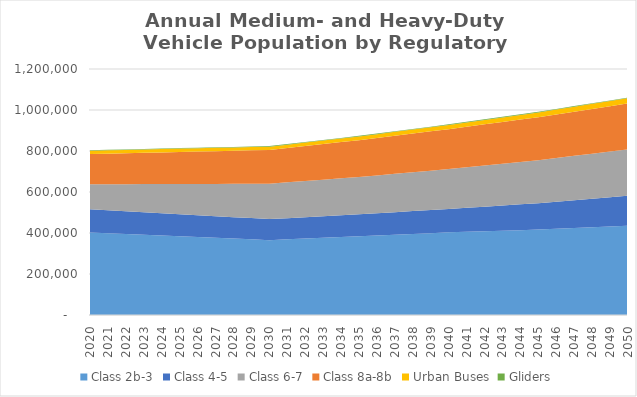
| Category | Class 2b-3 | Class 4-5 | Class 6-7 | Class 8a-8b | Urban Buses | Gliders |
|---|---|---|---|---|---|---|
| 2020.0 | 402990 | 112940 | 121620 | 147440 | 16210 | 2140 |
| 2021.0 | 399220 | 111900 | 126720 | 149190 | 16250 | 2220 |
| 2022.0 | 395440 | 110860 | 131830 | 150950 | 16300 | 2290 |
| 2023.0 | 391670 | 109820 | 136930 | 152700 | 16340 | 2370 |
| 2024.0 | 387890 | 108780 | 142040 | 154460 | 16390 | 2440 |
| 2025.0 | 384120 | 107740 | 147140 | 156210 | 16430 | 2520 |
| 2026.0 | 380340 | 106700 | 152240 | 157960 | 16240 | 2600 |
| 2027.0 | 376570 | 105660 | 157350 | 159710 | 16050 | 2670 |
| 2028.0 | 372790 | 104620 | 162450 | 161470 | 15870 | 2750 |
| 2029.0 | 369020 | 103580 | 167560 | 163220 | 15680 | 2820 |
| 2030.0 | 365240 | 102540 | 172660 | 164970 | 15490 | 2900 |
| 2031.0 | 369070 | 103380 | 174590 | 167890 | 15960 | 2930 |
| 2032.0 | 372900 | 104220 | 176530 | 170810 | 16430 | 2950 |
| 2033.0 | 376730 | 105070 | 178460 | 173730 | 16910 | 2980 |
| 2034.0 | 380560 | 105910 | 180400 | 176650 | 17380 | 3000 |
| 2035.0 | 384390 | 106750 | 182330 | 179570 | 17850 | 3030 |
| 2036.0 | 388120 | 108230 | 184740 | 182670 | 18360 | 3040 |
| 2037.0 | 391850 | 109720 | 187150 | 185770 | 18870 | 3040 |
| 2038.0 | 395590 | 111200 | 189560 | 188870 | 19380 | 3050 |
| 2039.0 | 399320 | 112690 | 191970 | 191970 | 19890 | 3050 |
| 2040.0 | 403050 | 114170 | 194380 | 195070 | 20400 | 3060 |
| 2041.0 | 405780 | 117120 | 197460 | 198000 | 20930 | 3040 |
| 2042.0 | 408510 | 120080 | 200530 | 200930 | 21460 | 3020 |
| 2043.0 | 411250 | 123030 | 203610 | 203860 | 21990 | 3010 |
| 2044.0 | 413980 | 125990 | 206680 | 206790 | 22520 | 2990 |
| 2045.0 | 416710 | 128940 | 209760 | 209720 | 23050 | 2970 |
| 2046.0 | 420470 | 132420 | 213070 | 212600 | 23590 | 2940 |
| 2047.0 | 424230 | 135900 | 216390 | 215480 | 24130 | 2900 |
| 2048.0 | 428000 | 139380 | 219700 | 218360 | 24680 | 2870 |
| 2049.0 | 431760 | 142860 | 223020 | 221240 | 25220 | 2830 |
| 2050.0 | 435520 | 146340 | 226330 | 224120 | 25760 | 2800 |